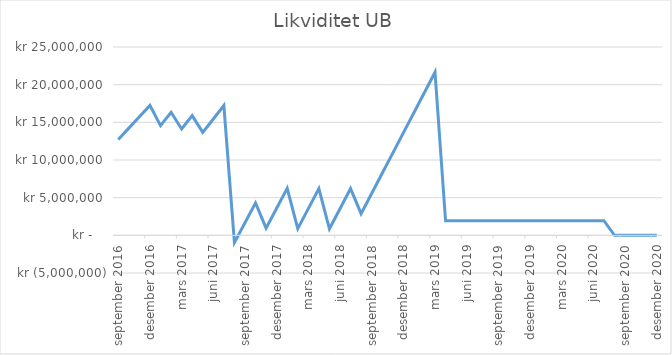
| Category | Likviditet UB |
|---|---|
| 2016-09-01 | 12725513.125 |
| 2016-10-01 | 14230966.571 |
| 2016-11-01 | 15737360.925 |
| 2016-12-01 | 17244696.775 |
| 2017-01-01 | 14567333.333 |
| 2017-02-01 | 16335771.25 |
| 2017-03-01 | 14111147.774 |
| 2017-04-01 | 15885133.908 |
| 2017-05-01 | 13666062.116 |
| 2017-06-01 | 15445603.405 |
| 2017-07-01 | 17226256.907 |
| 2017-08-01 | -962810.015 |
| 2017-09-01 | 1669754.895 |
| 2017-10-01 | 4303965.158 |
| 2017-11-01 | 948571.803 |
| 2017-12-01 | 3591081.327 |
| 2018-01-01 | 6235242.42 |
| 2018-02-01 | 892722.78 |
| 2018-03-01 | 3546864.065 |
| 2018-04-01 | 6202664.188 |
| 2018-05-01 | 871790.853 |
| 2018-06-01 | 3537585.723 |
| 2018-07-01 | 6205046.714 |
| 2018-08-01 | 2882924.868 |
| 2018-09-01 | 5558726.696 |
| 2018-10-01 | 8236200.9 |
| 2018-11-01 | 10915348.526 |
| 2018-12-01 | 13596170.618 |
| 2019-01-01 | 16278668.225 |
| 2019-02-01 | 18962842.393 |
| 2019-03-01 | 21648694.169 |
| 2019-04-01 | 1925224.603 |
| 2019-05-01 | 1926427.869 |
| 2019-06-01 | 1927631.886 |
| 2019-07-01 | 1928836.656 |
| 2019-08-01 | 1930042.179 |
| 2019-09-01 | 1931248.455 |
| 2019-10-01 | 1932455.485 |
| 2019-11-01 | 1933663.27 |
| 2019-12-01 | 1934871.81 |
| 2020-01-01 | 1936081.105 |
| 2020-02-01 | 1937291.155 |
| 2020-03-01 | 1938501.962 |
| 2020-04-01 | 1939713.526 |
| 2020-05-01 | 1940925.847 |
| 2020-06-01 | 1942138.926 |
| 2020-07-01 | 1943352.762 |
| 2020-08-01 | 0 |
| 2020-09-01 | 0 |
| 2020-10-01 | 0 |
| 2020-11-01 | 0 |
| 2020-12-01 | 0 |